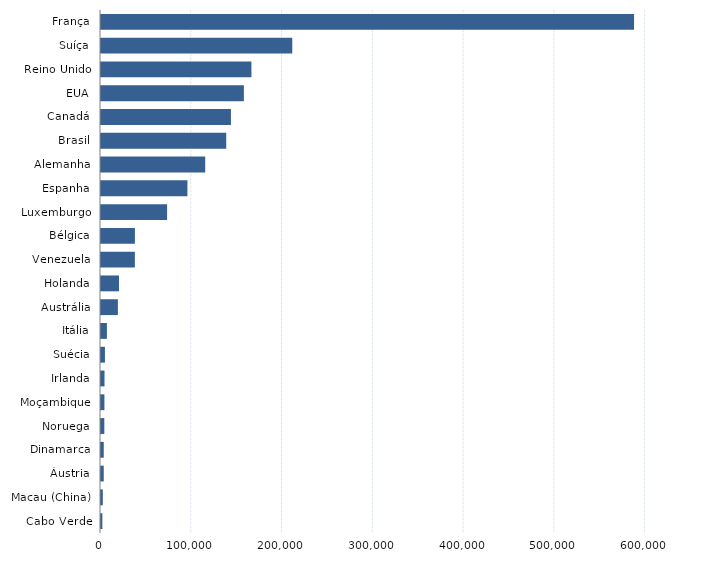
| Category | Series 0 |
|---|---|
| Cabo Verde | 1491 |
| Macau (China) | 2011 |
| Áustria | 3020 |
| Dinamarca | 3033 |
| Noruega | 3664 |
| Moçambique | 3767 |
| Irlanda | 3866 |
| Suécia | 4336 |
| Itália | 6520 |
| Austrália | 18610 |
| Holanda | 19820 |
| Venezuela | 37326 |
| Bélgica | 37376 |
| Luxemburgo | 72821 |
| Espanha | 95221 |
| Alemanha | 114825 |
| Brasil | 137973 |
| Canadá | 143160 |
| EUA | 157418 |
| Reino Unido | 165726 |
| Suíça | 210731 |
| França | 587300 |